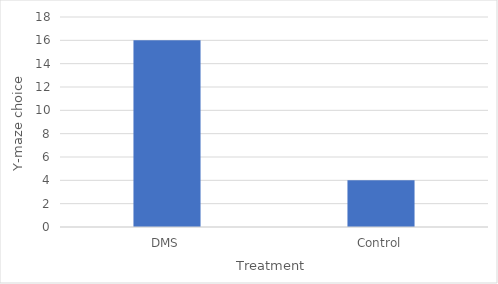
| Category | Series 0 |
|---|---|
| DMS | 16 |
| Control | 4 |